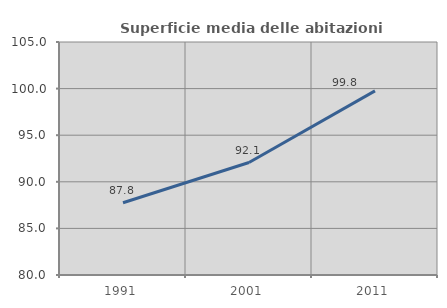
| Category | Superficie media delle abitazioni occupate |
|---|---|
| 1991.0 | 87.753 |
| 2001.0 | 92.066 |
| 2011.0 | 99.761 |